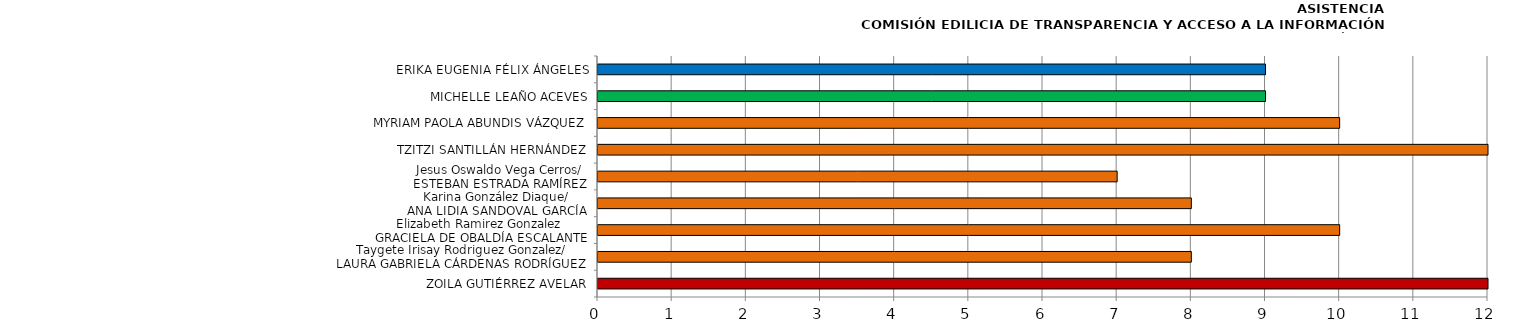
| Category | Series 0 |
|---|---|
| ZOILA GUTIÉRREZ AVELAR | 12 |
| Taygete Irisay Rodriguez Gonzalez/
LAURA GABRIELA CÁRDENAS RODRÍGUEZ | 8 |
| Elizabeth Ramirez Gonzalez 
GRACIELA DE OBALDÍA ESCALANTE | 10 |
| Karina González Diaque/
ANA LIDIA SANDOVAL GARCÍA | 8 |
| Jesus Oswaldo Vega Cerros/
ESTEBAN ESTRADA RAMÍREZ | 7 |
| TZITZI SANTILLÁN HERNÁNDEZ | 12 |
| MYRIAM PAOLA ABUNDIS VÁZQUEZ | 10 |
| MICHELLE LEAÑO ACEVES | 9 |
| ERIKA EUGENIA FÉLIX ÁNGELES | 9 |